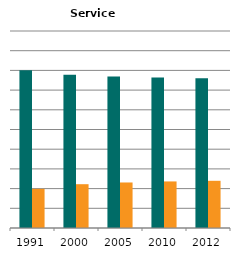
| Category | Male | Female |
|---|---|---|
| 1991.0 | 0.801 | 0.199 |
| 2000.0 | 0.778 | 0.222 |
| 2005.0 | 0.769 | 0.231 |
| 2010.0 | 0.764 | 0.236 |
| 2012.0 | 0.76 | 0.24 |